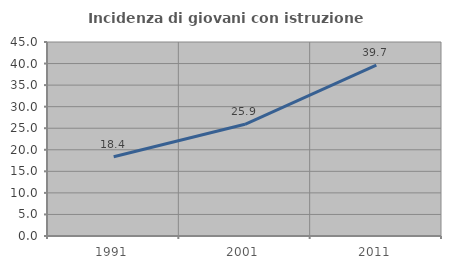
| Category | Incidenza di giovani con istruzione universitaria |
|---|---|
| 1991.0 | 18.376 |
| 2001.0 | 25.909 |
| 2011.0 | 39.655 |